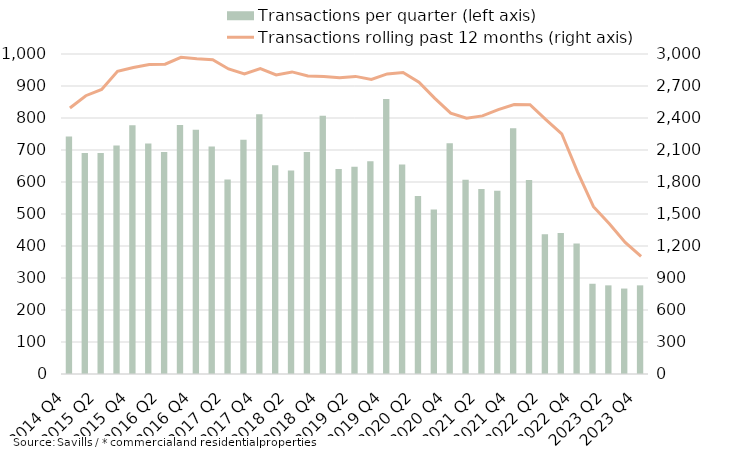
| Category | Transactions per quarter (left axis) |
|---|---|
| 2014 Q4 | 742 |
| 2015 Q1 | 691 |
| 2015 Q2 | 691 |
| 2015 Q3 | 714 |
| 2015 Q4 | 777 |
| 2016 Q1 | 720 |
| 2016 Q2 | 694 |
| 2016 Q3 | 778 |
| 2016 Q4 | 763 |
| 2017 Q1 | 711 |
| 2017 Q2 | 608 |
| 2017 Q3 | 732 |
| 2017 Q4 | 812 |
| 2018 Q1 | 652 |
| 2018 Q2 | 636 |
| 2018 Q3 | 694 |
| 2018 Q4 | 807 |
| 2019 Q1 | 641 |
| 2019 Q2 | 648 |
| 2019 Q3 | 665 |
| 2019 Q4 | 859 |
| 2020 Q1 | 655 |
| 2020 Q2 | 556 |
| 2020 Q3 | 514 |
| 2020 Q4 | 721 |
| 2021 Q1 | 607 |
| 2021 Q2 | 578 |
| 2021 Q3 | 573 |
| 2021 Q4 | 768 |
| 2022 Q1 | 606 |
| 2022 Q2 | 437 |
| 2022 Q3 | 441 |
| 2022 Q4 | 408 |
| 2023 Q1 | 282 |
| 2023 Q2 | 277 |
| 2023 Q3 | 267 |
| 2023 Q4 | 277 |